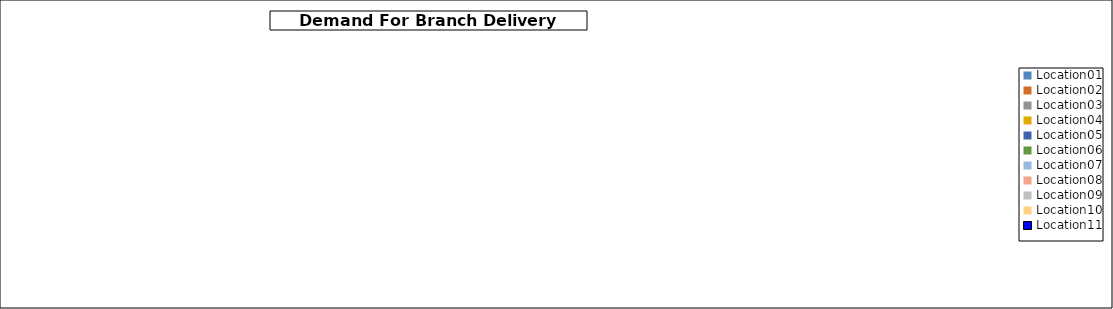
| Category | Data A |
|---|---|
| Location01 | 0 |
| Location02 | 0 |
| Location03 | 0 |
| Location04 | 0 |
| Location05 | 0 |
| Location06 | 0 |
| Location07 | 0 |
| Location08 | 0 |
| Location09 | 0 |
| Location10 | 0 |
| Location11 | 0 |